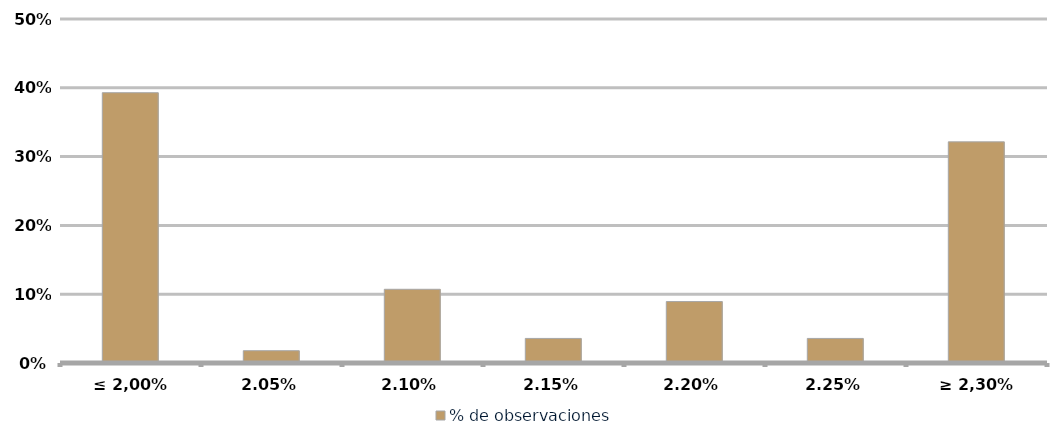
| Category | % de observaciones  |
|---|---|
| ≤ 2,00% | 0.393 |
| 2,05% | 0.018 |
| 2,10% | 0.107 |
| 2,15% | 0.036 |
| 2,20% | 0.089 |
| 2,25% | 0.036 |
| ≥ 2,30% | 0.321 |